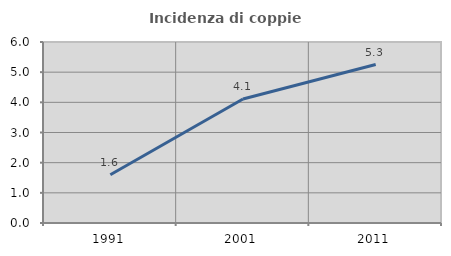
| Category | Incidenza di coppie miste |
|---|---|
| 1991.0 | 1.599 |
| 2001.0 | 4.11 |
| 2011.0 | 5.254 |